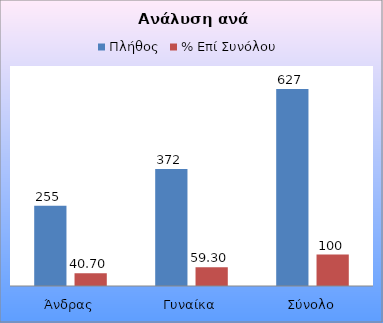
| Category | Πλήθος | % Επί Συνόλου |
|---|---|---|
| Άνδρας | 255 | 40.7 |
| Γυναίκα | 372 | 59.3 |
| Σύνολο | 627 | 100 |